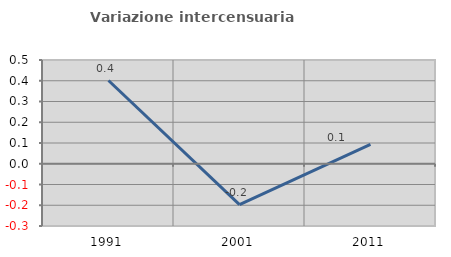
| Category | Variazione intercensuaria annua |
|---|---|
| 1991.0 | 0.401 |
| 2001.0 | -0.197 |
| 2011.0 | 0.094 |